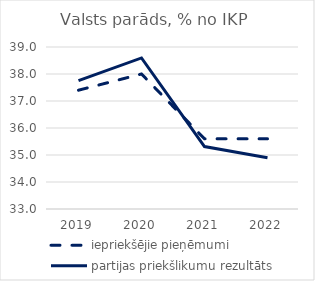
| Category | iepriekšējie pieņēmumi | partijas priekšlikumu rezultāts |
|---|---|---|
| 2019.0 | 37.4 | 37.752 |
| 2020.0 | 38 | 38.594 |
| 2021.0 | 35.6 | 35.314 |
| 2022.0 | 35.6 | 34.901 |